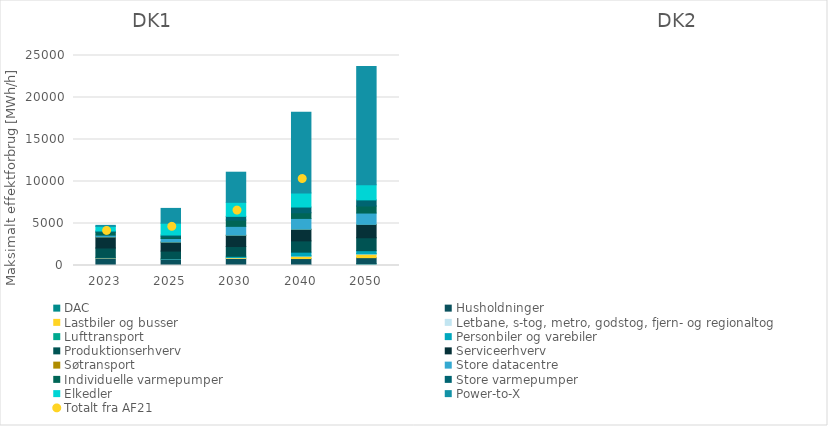
| Category | DAC | Husholdninger | Lastbiler og busser | Letbane, s-tog, metro, godstog, fjern- og regionaltog | Lufttransport | Personbiler og varebiler | Produktionserhverv | Serviceerhverv | Søtransport | Store datacentre | Individuelle varmepumper | Store varmepumper  | Elkedler | Power-to-X |
|---|---|---|---|---|---|---|---|---|---|---|---|---|---|---|
| 2023.0 | 0 | 906.499 | 6.573 | 26.932 | 0 | 23.241 | 1119.329 | 1319.327 | 0.999 | 210.42 | 359.761 | 131.345 | 556.282 | 116 |
| 2025.0 | 0 | 714.493 | 12.086 | 26.736 | 0 | 35.271 | 927.427 | 1069.745 | 1.179 | 424.602 | 203.416 | 210.791 | 1408.503 | 1762.5 |
| 2030.0 | 0 | 839.732 | 73.285 | 61.259 | 0.482 | 117.014 | 1166.284 | 1339.352 | 4.554 | 1056.568 | 751.959 | 440.58 | 1668.464 | 3587 |
| 2040.0 | 99.613 | 727.832 | 262.835 | 62.317 | 4.002 | 431.076 | 1342.319 | 1371.747 | 10.806 | 1291.281 | 673.949 | 683.882 | 1681.65 | 9587 |
| 2050.0 | 214.041 | 720.609 | 403.012 | 60.195 | 15.177 | 353.743 | 1533.075 | 1578.815 | 12.594 | 1353.568 | 835.114 | 732.641 | 1798.126 | 14087 |